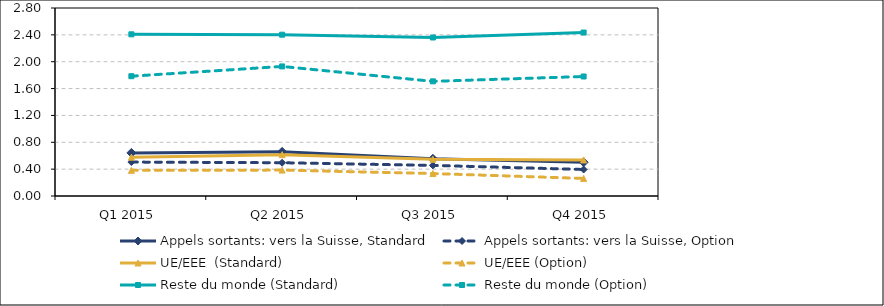
| Category | Appels sortants: vers la Suisse, Standard | Appels sortants: vers la Suisse, Option | UE/EEE  (Standard) | UE/EEE (Option) | Reste du monde (Standard) | Reste du monde (Option) |
|---|---|---|---|---|---|---|
| Q1 2015 | 0.642 | 0.505 | 0.578 | 0.382 | 2.408 | 1.784 |
| Q2 2015 | 0.657 | 0.495 | 0.616 | 0.386 | 2.402 | 1.93 |
| Q3 2015 | 0.554 | 0.456 | 0.547 | 0.334 | 2.361 | 1.708 |
| Q4 2015 | 0.503 | 0.395 | 0.537 | 0.262 | 2.434 | 1.78 |